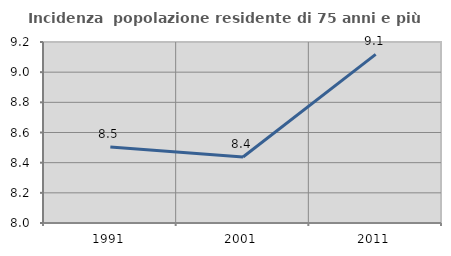
| Category | Incidenza  popolazione residente di 75 anni e più |
|---|---|
| 1991.0 | 8.504 |
| 2001.0 | 8.438 |
| 2011.0 | 9.118 |